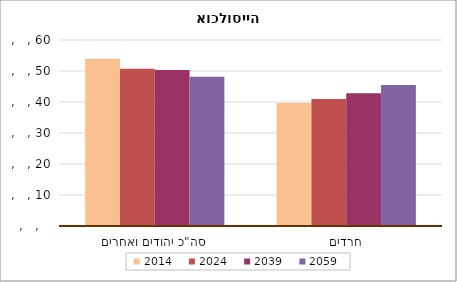
| Category | 2014 | 2024 | 2039 | 2059 |
|---|---|---|---|---|
| סה"כ יהודים ואחרים | 53.957 | 50.745 | 50.344 | 48.132 |
| חרדים | 39.681 | 40.988 | 42.86 | 45.466 |